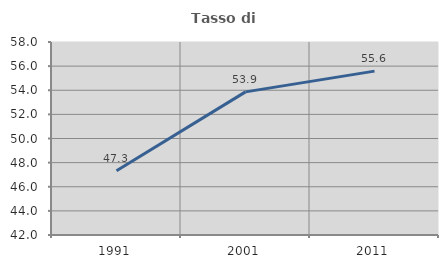
| Category | Tasso di occupazione   |
|---|---|
| 1991.0 | 47.322 |
| 2001.0 | 53.864 |
| 2011.0 | 55.585 |